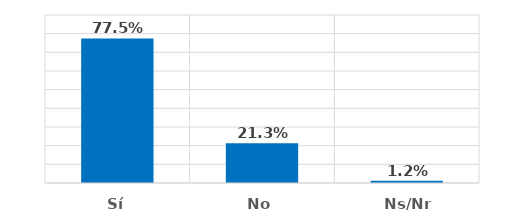
| Category | Series 0 |
|---|---|
| Sí | 0.775 |
| No | 0.213 |
| Ns/Nr | 0.012 |